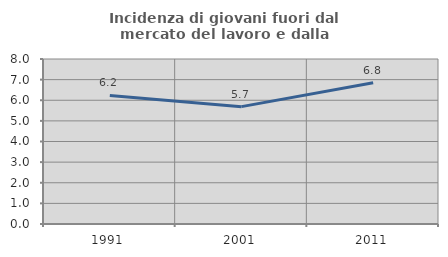
| Category | Incidenza di giovani fuori dal mercato del lavoro e dalla formazione  |
|---|---|
| 1991.0 | 6.231 |
| 2001.0 | 5.69 |
| 2011.0 | 6.845 |